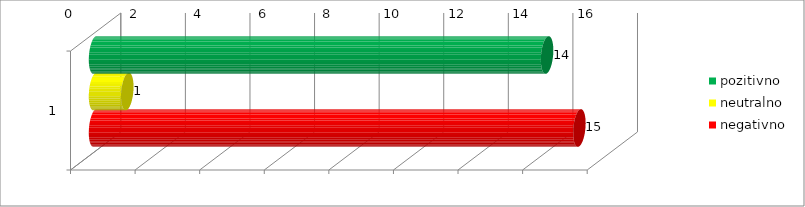
| Category | pozitivno | neutralno | negativno |
|---|---|---|---|
| 0 | 14 | 1 | 15 |